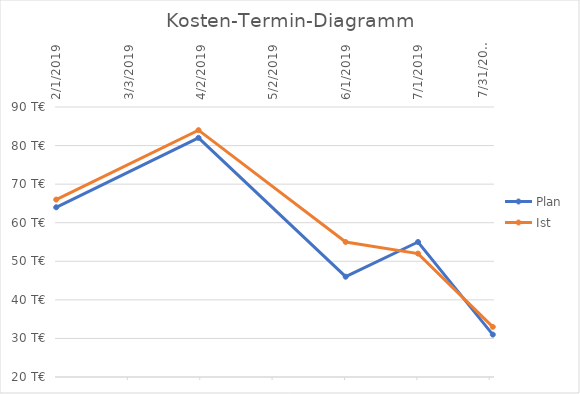
| Category | Plan | Ist |
|---|---|---|
| 2/1/19 | 64 | 66 |
| 4/1/19 | 82 | 84 |
| 6/1/19 | 46 | 55 |
| 7/1/19 | 55 | 52 |
| 8/1/19 | 31 | 33 |